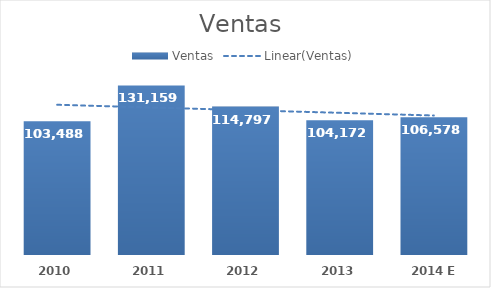
| Category | Ventas |
|---|---|
| 2010 | 103488.328 |
| 2011 | 131159.476 |
| 2012 | 114796.717 |
| 2013 | 104171.929 |
| 2014 E | 106578.207 |